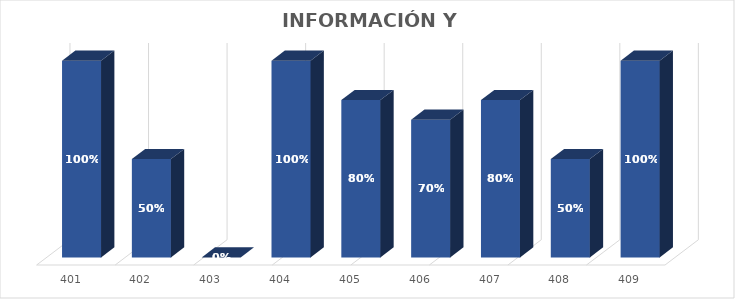
| Category | % Avance |
|---|---|
| 401.0 | 1 |
| 402.0 | 0.5 |
| 403.0 | 0 |
| 404.0 | 1 |
| 405.0 | 0.8 |
| 406.0 | 0.7 |
| 407.0 | 0.8 |
| 408.0 | 0.5 |
| 409.0 | 1 |